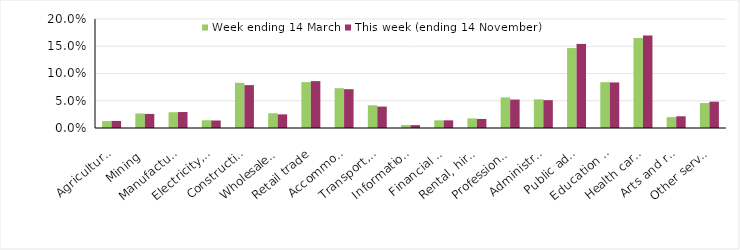
| Category | Week ending 14 March | This week (ending 14 November) |
|---|---|---|
| Agriculture, forestry and fishing | 0.013 | 0.013 |
| Mining | 0.027 | 0.026 |
| Manufacturing | 0.029 | 0.029 |
| Electricity, gas, water and waste services | 0.014 | 0.014 |
| Construction | 0.083 | 0.079 |
| Wholesale trade | 0.027 | 0.025 |
| Retail trade | 0.084 | 0.086 |
| Accommodation and food services | 0.073 | 0.071 |
| Transport, postal and warehousing | 0.042 | 0.039 |
| Information media and telecommunications | 0.005 | 0.005 |
| Financial and insurance services | 0.014 | 0.014 |
| Rental, hiring and real estate services | 0.018 | 0.017 |
| Professional, scientific and technical services | 0.056 | 0.052 |
| Administrative and support services | 0.053 | 0.051 |
| Public administration and safety | 0.147 | 0.154 |
| Education and training | 0.084 | 0.084 |
| Health care and social assistance | 0.165 | 0.17 |
| Arts and recreation services | 0.02 | 0.022 |
| Other services | 0.046 | 0.048 |